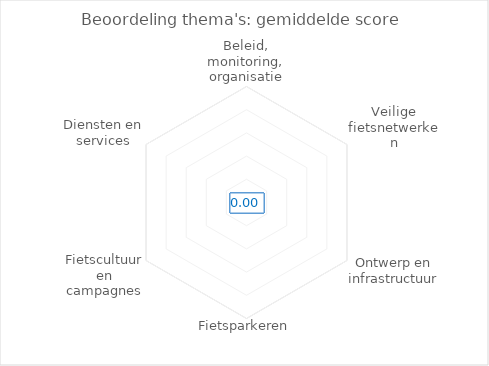
| Category | Gemiddelde score |
|---|---|
| Beleid, monitoring, organisatie | 0 |
| Veilige fietsnetwerken | 0 |
| Ontwerp en infrastructuur | 0 |
| Fietsparkeren | 0 |
| Fietscultuur en campagnes | 0 |
| Diensten en services | 0 |